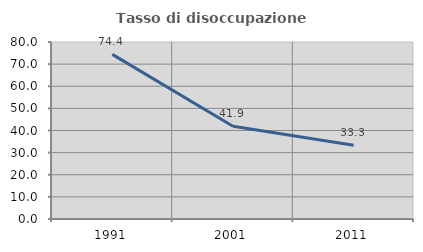
| Category | Tasso di disoccupazione giovanile  |
|---|---|
| 1991.0 | 74.408 |
| 2001.0 | 41.912 |
| 2011.0 | 33.333 |